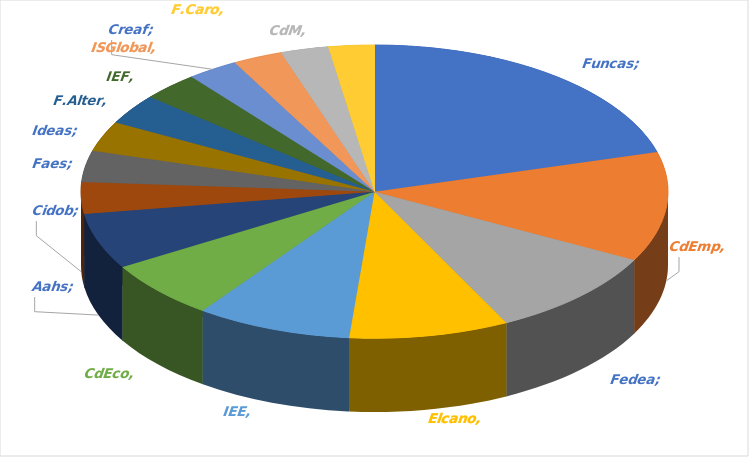
| Category | Series 0 |
|---|---|
| FUNCAS | 0.167 |
| CdEmp | 0.098 |
| FEDEA | 0.08 |
| Elcano | 0.071 |
| IEE | 0.069 |
| CdEco | 0.052 |
| AAHS | 0.05 |
| CIDOB | 0.028 |
| FAES | 0.028 |
| IDEAS | 0.027 |
| F.Alter | 0.027 |
| IEF | 0.025 |
| CREAF | 0.023 |
| ISGlobal | 0.022 |
| CdM | 0.021 |
| F.Caro | 0.02 |